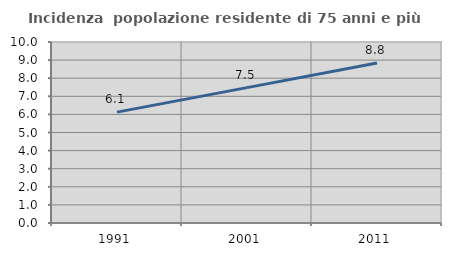
| Category | Incidenza  popolazione residente di 75 anni e più |
|---|---|
| 1991.0 | 6.126 |
| 2001.0 | 7.479 |
| 2011.0 | 8.836 |